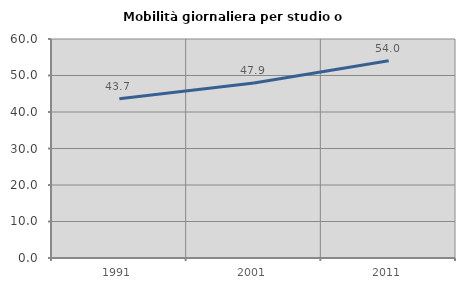
| Category | Mobilità giornaliera per studio o lavoro |
|---|---|
| 1991.0 | 43.66 |
| 2001.0 | 47.933 |
| 2011.0 | 54.029 |